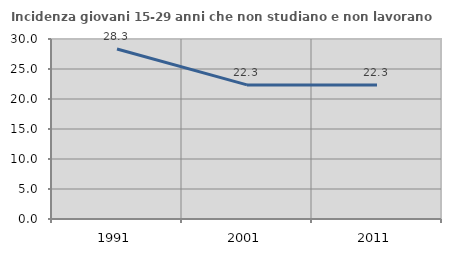
| Category | Incidenza giovani 15-29 anni che non studiano e non lavorano  |
|---|---|
| 1991.0 | 28.342 |
| 2001.0 | 22.345 |
| 2011.0 | 22.35 |